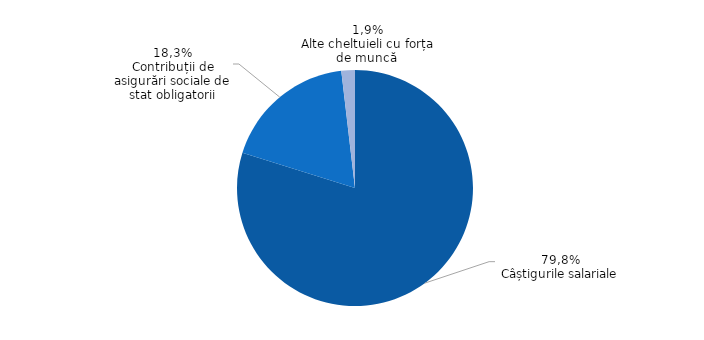
| Category | Series 0 |
|---|---|
| Câștigurile salariale | 79.841 |
| Contribuții de asigurări sociale de stat obligatorii | 18.299 |
| Alte cheltuieli cu forța de muncă  | 1.859 |